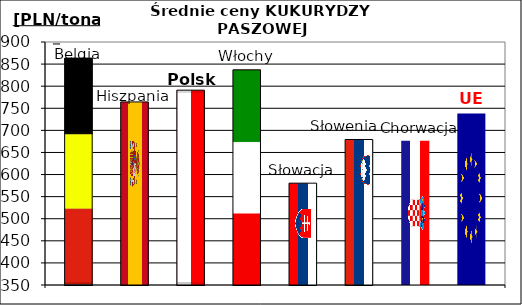
| Category | Belgia | Hiszpania | Polska | Włochy | Słowacja | Słowenia | Chorwacja | UE |
|---|---|---|---|---|---|---|---|---|
| 44038.0 | 863.573 | 764.373 | 790.986 | 837.002 | 580.498 | 679.344 | 676.735 | 738.303 |